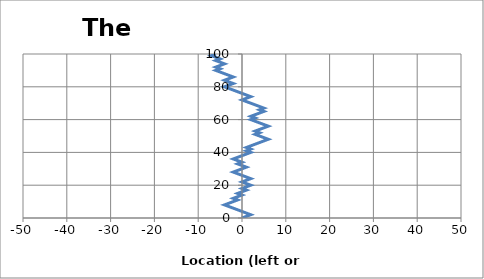
| Category | Series 0 |
|---|---|
| 0.0 | 0 |
| 1.0 | 1 |
| 2.0 | 2 |
| 1.0 | 3 |
| 0.0 | 4 |
| -1.0 | 5 |
| -2.0 | 6 |
| -3.0 | 7 |
| -4.0 | 8 |
| -3.0 | 9 |
| -2.0 | 10 |
| -1.0 | 11 |
| -2.0 | 12 |
| -1.0 | 13 |
| 0.0 | 14 |
| -1.0 | 15 |
| 0.0 | 16 |
| 1.0 | 17 |
| 0.0 | 18 |
| 1.0 | 19 |
| 2.0 | 20 |
| 1.0 | 21 |
| 0.0 | 22 |
| 1.0 | 23 |
| 2.0 | 24 |
| 1.0 | 25 |
| 0.0 | 26 |
| -1.0 | 27 |
| -2.0 | 28 |
| -1.0 | 29 |
| 0.0 | 30 |
| 1.0 | 31 |
| 0.0 | 32 |
| -1.0 | 33 |
| 0.0 | 34 |
| -1.0 | 35 |
| -2.0 | 36 |
| -1.0 | 37 |
| 0.0 | 38 |
| 1.0 | 39 |
| 2.0 | 40 |
| 1.0 | 41 |
| 2.0 | 42 |
| 1.0 | 43 |
| 2.0 | 44 |
| 3.0 | 45 |
| 4.0 | 46 |
| 5.0 | 47 |
| 6.0 | 48 |
| 5.0 | 49 |
| 4.0 | 50 |
| 3.0 | 51 |
| 4.0 | 52 |
| 3.0 | 53 |
| 4.0 | 54 |
| 5.0 | 55 |
| 6.0 | 56 |
| 5.0 | 57 |
| 4.0 | 58 |
| 3.0 | 59 |
| 2.0 | 60 |
| 3.0 | 61 |
| 2.0 | 62 |
| 3.0 | 63 |
| 4.0 | 64 |
| 5.0 | 65 |
| 4.0 | 66 |
| 5.0 | 67 |
| 4.0 | 68 |
| 3.0 | 69 |
| 2.0 | 70 |
| 1.0 | 71 |
| 0.0 | 72 |
| 1.0 | 73 |
| 2.0 | 74 |
| 1.0 | 75 |
| 0.0 | 76 |
| -1.0 | 77 |
| -2.0 | 78 |
| -3.0 | 79 |
| -4.0 | 80 |
| -3.0 | 81 |
| -2.0 | 82 |
| -3.0 | 83 |
| -4.0 | 84 |
| -3.0 | 85 |
| -2.0 | 86 |
| -3.0 | 87 |
| -4.0 | 88 |
| -5.0 | 89 |
| -6.0 | 90 |
| -5.0 | 91 |
| -6.0 | 92 |
| -5.0 | 93 |
| -4.0 | 94 |
| -5.0 | 95 |
| -6.0 | 96 |
| -5.0 | 97 |
| -6.0 | 98 |
| -7.0 | 99 |
| -6.0 | 100 |